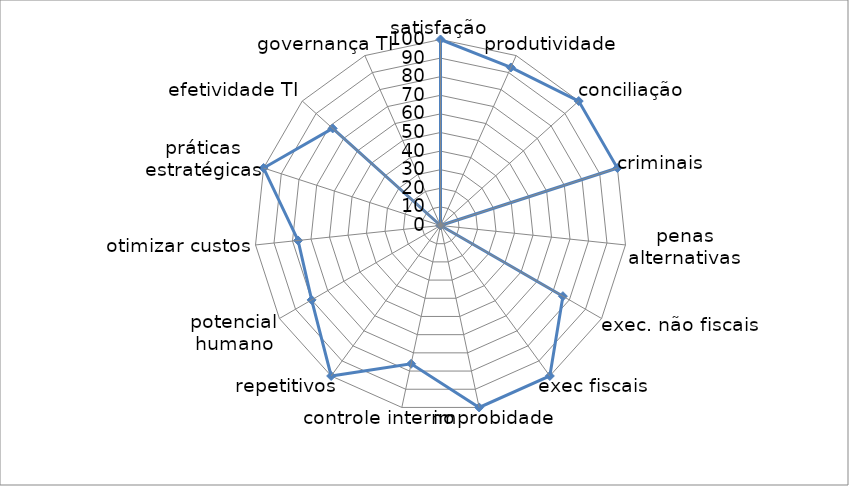
| Category | Series 0 |
|---|---|
| 0 | 100 |
| 1 | 93 |
| 2 | 100 |
| 3 | 100 |
| 4 | 0 |
| 5 | 76 |
| 6 | 100 |
| 7 | 100 |
| 8 | 76 |
| 9 | 100 |
| 10 | 80 |
| 11 | 77 |
| 12 | 100 |
| 13 | 78 |
| 14 | 0 |